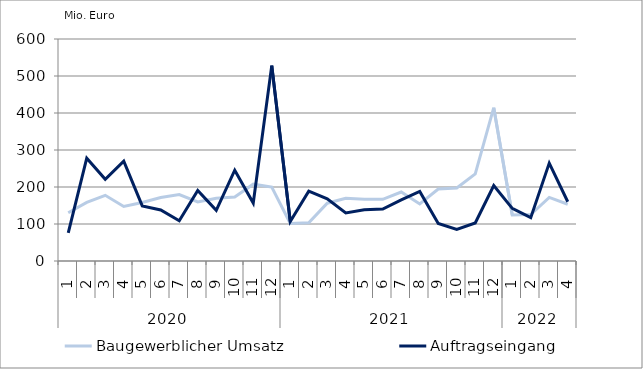
| Category | Baugewerblicher Umsatz | Auftragseingang |
|---|---|---|
| 0 | 130445.562 | 75891.481 |
| 1 | 158433.655 | 277923.85 |
| 2 | 177529.832 | 220973.626 |
| 3 | 147259.799 | 269936.091 |
| 4 | 157965.891 | 149072.895 |
| 5 | 171647.778 | 137984.76 |
| 6 | 179530.732 | 108645.965 |
| 7 | 159480.457 | 190771.468 |
| 8 | 169638.111 | 136988.906 |
| 9 | 173040.053 | 245341.603 |
| 10 | 207619.085 | 156647.224 |
| 11 | 199947.086 | 528166.004 |
| 12 | 101295.895 | 106850.127 |
| 13 | 103236.543 | 188883.434 |
| 14 | 156172.725 | 168204.42 |
| 15 | 169257.088 | 130052.073 |
| 16 | 166897.821 | 138492.214 |
| 17 | 166720.216 | 140262.426 |
| 18 | 186515.191 | 165331.191 |
| 19 | 154188.941 | 188169.655 |
| 20 | 194464.12 | 101359.538 |
| 21 | 197281.201 | 85626.862 |
| 22 | 235325.083 | 102880.924 |
| 23 | 414469.471 | 203900.676 |
| 24 | 124217.549 | 142351.759 |
| 25 | 125619.696 | 117194.423 |
| 26 | 171896.664 | 264509.013 |
| 27 | 153384.654 | 160146.519 |